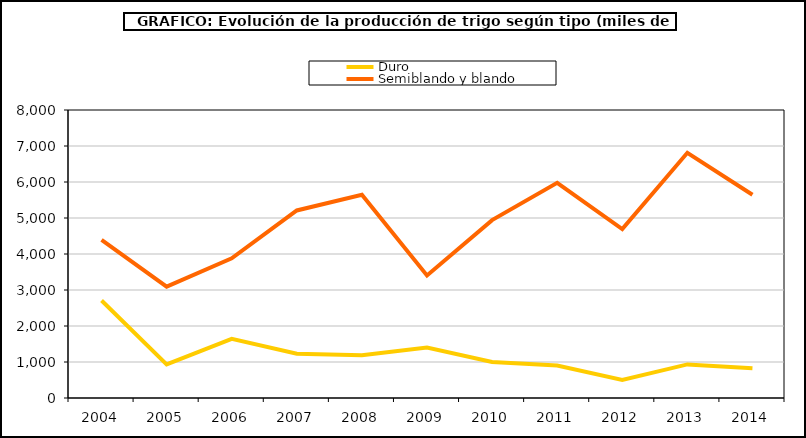
| Category | Duro | Semiblando y blando |
|---|---|---|
| 2004 | 2707.828 | 4388.896 |
| 2005 | 934.523 | 3092.171 |
| 2006 | 1643.214 | 3878.368 |
| 2007 | 1227.124 | 5209.235 |
| 2008 | 1184.844 | 5646.617 |
| 2009 | 1401.499 | 3403.273 |
| 2010 | 999.861 | 4941.336 |
| 2011 | 900.352 | 5976.299 |
| 2012 | 499.493 | 4690.335 |
| 2013 | 933.268 | 6811.661 |
| 2014 | 825.433 | 5647.301 |